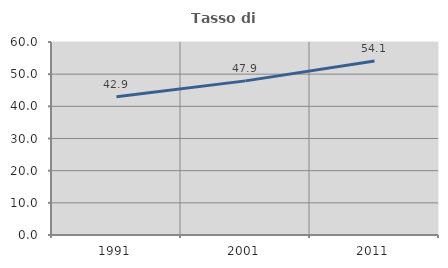
| Category | Tasso di occupazione   |
|---|---|
| 1991.0 | 42.946 |
| 2001.0 | 47.913 |
| 2011.0 | 54.089 |